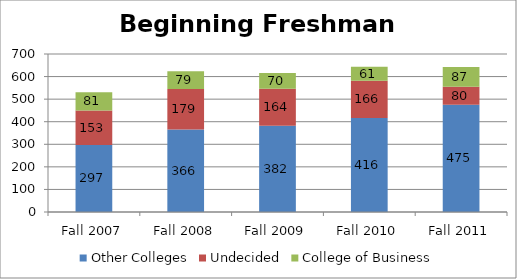
| Category | Other Colleges | Undecided | College of Business |
|---|---|---|---|
| Fall 2007 | 297 | 153 | 81 |
| Fall 2008 | 366 | 179 | 79 |
| Fall 2009 | 382 | 164 | 70 |
| Fall 2010 | 416 | 166 | 61 |
| Fall 2011 | 475 | 80 | 87 |